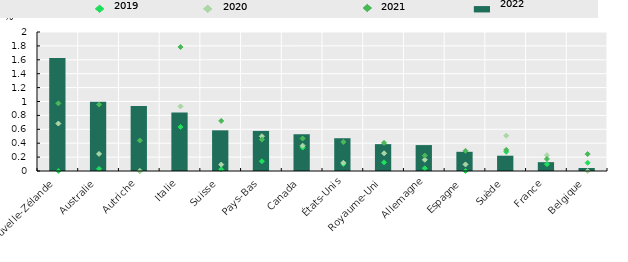
| Category | 2022 |
|---|---|
| 0 | 1.627 |
| 1 | 0.995 |
| 2 | 0.936 |
| 3 | 0.841 |
| 4 | 0.585 |
| 5 | 0.577 |
| 6 | 0.529 |
| 7 | 0.472 |
| 8 | 0.387 |
| 9 | 0.373 |
| 10 | 0.276 |
| 11 | 0.22 |
| 12 | 0.127 |
| 13 | 0.043 |